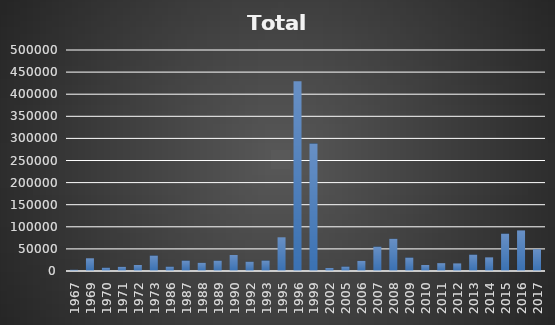
| Category | Total Abundance |
|---|---|
| 1967.0 | 2777 |
| 1969.0 | 28776 |
| 1970.0 | 7403 |
| 1971.0 | 9365 |
| 1972.0 | 13592 |
| 1973.0 | 34923 |
| 1986.0 | 9775 |
| 1987.0 | 23521 |
| 1988.0 | 18446 |
| 1989.0 | 23320 |
| 1990.0 | 36190 |
| 1992.0 | 20986 |
| 1993.0 | 23702 |
| 1995.0 | 76250 |
| 1996.0 | 429309 |
| 1999.0 | 288226 |
| 2002.0 | 6820 |
| 2005.0 | 9987 |
| 2006.0 | 22798 |
| 2007.0 | 55089 |
| 2008.0 | 72826 |
| 2009.0 | 30422 |
| 2010.0 | 13565 |
| 2011.0 | 17740 |
| 2012.0 | 17182 |
| 2013.0 | 36995 |
| 2014.0 | 30832 |
| 2015.0 | 84484 |
| 2016.0 | 91804 |
| 2017.0 | 49424 |